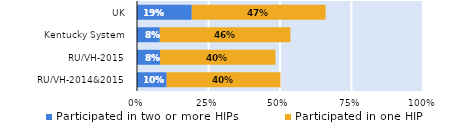
| Category | Participated in two or more HIPs | Participated in one HIP |
|---|---|---|
| RU/VH-2014&2015 | 0.104 | 0.398 |
| RU/VH-2015 | 0.081 | 0.403 |
| Kentucky System | 0.08 | 0.457 |
| UK | 0.191 | 0.468 |